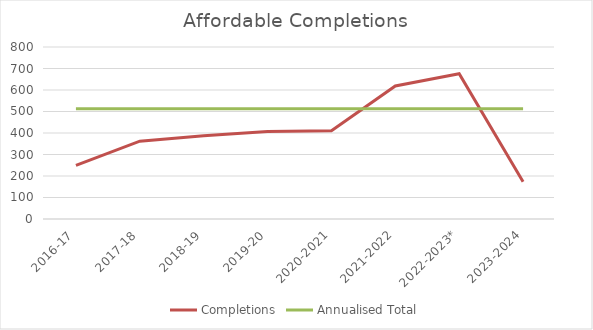
| Category | Completions | Annualised Total |
|---|---|---|
| 2016-17 | 249 | 513 |
| 2017-18 | 362 | 513 |
| 2018-19 | 387 | 513 |
| 2019-20 | 407 | 513 |
| 2020-2021 | 410 | 513 |
| 2021-2022 | 619 | 513 |
| 2022-2023* | 676 | 513 |
| 2023-2024 | 173 | 513 |